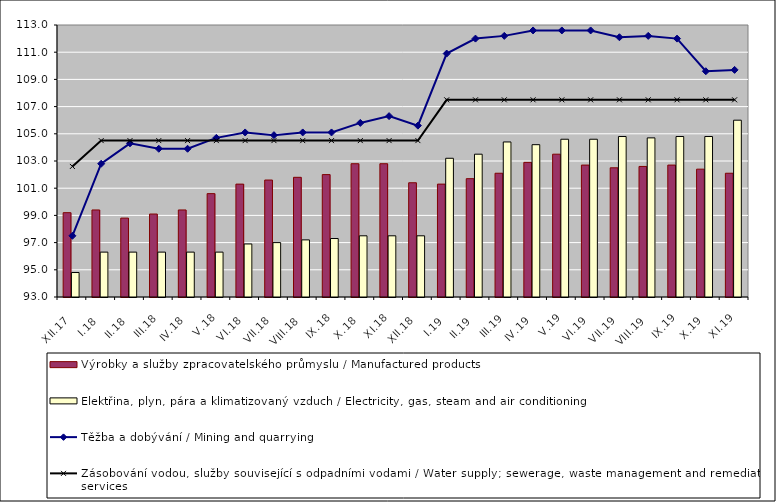
| Category | Výrobky a služby zpracovatelského průmyslu / Manufactured products | Elektřina, plyn, pára a klimatizovaný vzduch / Electricity, gas, steam and air conditioning |
|---|---|---|
| XII.17 | 99.2 | 94.8 |
| I.18 | 99.4 | 96.3 |
| II.18 | 98.8 | 96.3 |
| III.18 | 99.1 | 96.3 |
| IV.18 | 99.4 | 96.3 |
| V.18 | 100.6 | 96.3 |
| VI.18 | 101.3 | 96.9 |
| VII.18 | 101.6 | 97 |
| VIII.18 | 101.8 | 97.2 |
| IX.18 | 102 | 97.3 |
| X.18 | 102.8 | 97.5 |
| XI.18 | 102.8 | 97.5 |
| XII.18 | 101.4 | 97.5 |
| I.19 | 101.3 | 103.2 |
| II.19 | 101.7 | 103.5 |
| III.19 | 102.1 | 104.4 |
| IV.19 | 102.9 | 104.2 |
| V.19 | 103.5 | 104.6 |
| VI.19 | 102.7 | 104.6 |
| VII.19 | 102.5 | 104.8 |
| VIII.19 | 102.6 | 104.7 |
| IX.19 | 102.7 | 104.8 |
| X.19 | 102.4 | 104.8 |
| XI.19 | 102.1 | 106 |